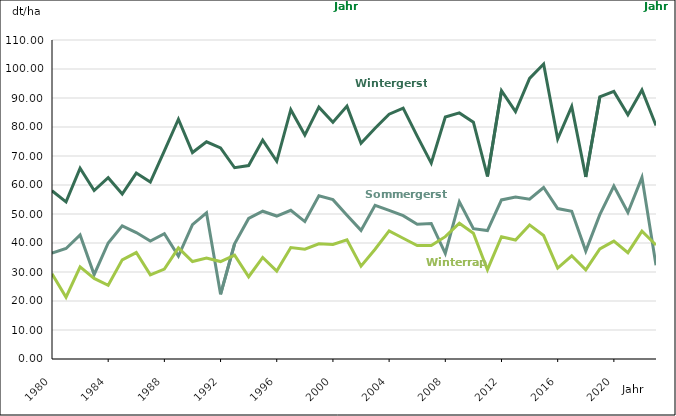
| Category | Jahr | Wintergerste | Sommergerste | Winterraps |
|---|---|---|---|---|
| 1980.0 | 1980 | 58 | 36.5 | 29.4 |
| 1981.0 | 1981 | 54.2 | 38.1 | 21.3 |
| 1982.0 | 1982 | 65.8 | 42.8 | 31.8 |
| 1983.0 | 1983 | 58.1 | 29.1 | 27.8 |
| 1984.0 | 1984 | 62.5 | 40 | 25.4 |
| 1985.0 | 1985 | 56.9 | 45.9 | 34.2 |
| 1986.0 | 1986 | 64.1 | 43.6 | 36.7 |
| 1987.0 | 1987 | 61 | 40.7 | 29 |
| 1988.0 | 1988 | 71.8 | 43.2 | 31 |
| 1989.0 | 1989 | 82.7 | 35.5 | 38.3 |
| 1990.0 | 1990 | 71.2 | 46.3 | 33.6 |
| 1991.0 | 1991 | 74.9 | 50.4 | 34.8 |
| 1992.0 | 1992 | 72.8 | 22.3 | 33.6 |
| 1993.0 | 1993 | 65.95 | 39.75 | 35.8 |
| 1994.0 | 1994 | 66.69 | 48.47 | 28.36 |
| 1995.0 | 1995 | 75.47 | 50.96 | 35.03 |
| 1996.0 | 1996 | 68.18 | 49.3 | 30.33 |
| 1997.0 | 1997 | 85.97 | 51.27 | 38.44 |
| 1998.0 | 1998 | 77.22 | 47.39 | 37.87 |
| 1999.0 | 1999 | 86.85 | 56.28 | 39.7 |
| 2000.0 | 2000 | 81.67 | 54.94 | 39.48 |
| 2001.0 | 2001 | 87.2 | 49.6 | 41.11 |
| 2002.0 | 2002 | 74.39 | 44.35 | 32.03 |
| 2003.0 | 2003 | 79.59 | 53.01 | 37.85 |
| 2004.0 | 2004 | 84.4 | 51.26 | 44.17 |
| 2005.0 | 2005 | 86.52 | 49.41 | 41.65 |
| 2006.0 | 2006 | 76.84 | 46.44 | 39.13 |
| 2007.0 | 2007 | 67.54 | 46.74 | 39.1 |
| 2008.0 | 2008 | 83.42 | 36.38 | 42.19 |
| 2009.0 | 2009 | 84.86 | 54.2 | 46.83 |
| 2010.0 | 2010 | 81.68 | 44.96 | 43.38 |
| 2011.0 | 2011 | 62.94 | 44.3 | 30.79 |
| 2012.0 | 2012 | 92.53 | 54.86 | 42.17 |
| 2013.0 | 2013 | 85.3 | 55.86 | 41.04 |
| 2014.0 | 2014 | 96.75 | 55.13 | 46.24 |
| 2015.0 | 2015 | 101.72 | 59.13 | 42.56 |
| 2016.0 | 2016 | 75.88 | 51.87 | 31.36 |
| 2017.0 | 2017 | 87.06 | 50.91 | 35.6 |
| 2018.0 | 2018 | 62.79 | 37.22 | 30.76 |
| 2019.0 | 2019 | 90.38 | 49.78 | 37.97 |
| 2020.0 | 2020 | 92.27 | 59.64 | 40.64 |
| 2021.0 | 2021 | 84.21 | 50.53 | 36.66 |
| 2022.0 | 2022 | 92.74 | 62.63 | 44.06 |
| 2023.0 | 2023 | 80.52 | 32.36 | 39.3 |